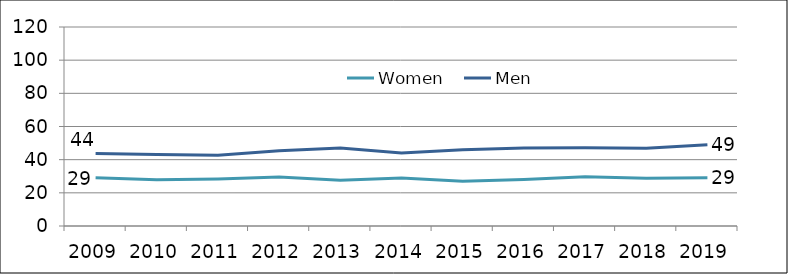
| Category | Women | Men |
|---|---|---|
| 2009.0 | 29.09 | 43.679 |
| 2010.0 | 27.823 | 43.171 |
| 2011.0 | 28.345 | 42.638 |
| 2012.0 | 29.512 | 45.383 |
| 2013.0 | 27.587 | 47.069 |
| 2014.0 | 29 | 44 |
| 2015.0 | 27 | 46 |
| 2016.0 | 28 | 47 |
| 2017.0 | 29.714 | 47.166 |
| 2018.0 | 28.82 | 46.918 |
| 2019.0 | 29.061 | 48.94 |